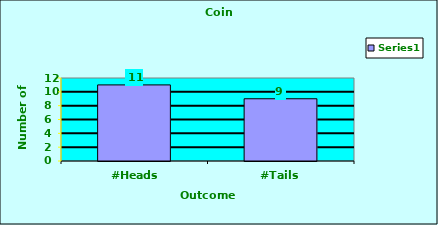
| Category | Series 0 |
|---|---|
| #Heads | 11 |
| #Tails | 9 |